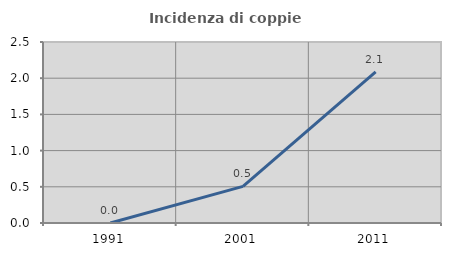
| Category | Incidenza di coppie miste |
|---|---|
| 1991.0 | 0 |
| 2001.0 | 0.506 |
| 2011.0 | 2.089 |